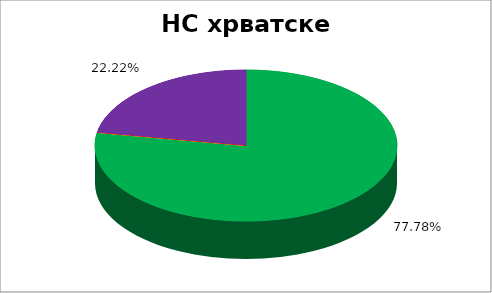
| Category | НС хрватске НМ |
|---|---|
| 0 | 0.778 |
| 1 | 0 |
| 2 | 0 |
| 3 | 0 |
| 4 | 0.222 |